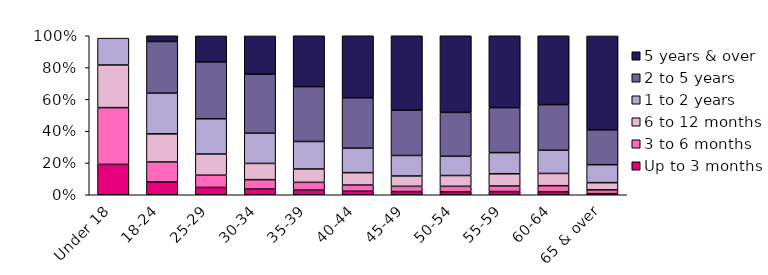
| Category | Up to 3 months | 3 to 6 months | 6 to 12 months | 1 to 2 years | 2 to 5 years | 5 years & over |
|---|---|---|---|---|---|---|
| Under 18 | 0.191 | 0.357 | 0.268 | 0.169 | 0 | 0 |
| 18-24 | 0.081 | 0.125 | 0.177 | 0.256 | 0.325 | 0.037 |
| 25-29 | 0.046 | 0.077 | 0.133 | 0.222 | 0.357 | 0.164 |
| 30-34 | 0.036 | 0.059 | 0.102 | 0.19 | 0.371 | 0.241 |
| 35-39 | 0.029 | 0.049 | 0.084 | 0.173 | 0.345 | 0.32 |
| 40-44 | 0.022 | 0.039 | 0.078 | 0.154 | 0.317 | 0.391 |
| 45-49 | 0.02 | 0.033 | 0.065 | 0.129 | 0.285 | 0.468 |
| 50-54 | 0.019 | 0.034 | 0.068 | 0.121 | 0.276 | 0.483 |
| 55-59 | 0.02 | 0.035 | 0.077 | 0.133 | 0.283 | 0.453 |
| 60-64 | 0.019 | 0.038 | 0.077 | 0.146 | 0.287 | 0.433 |
| 65 & over | 0.007 | 0.024 | 0.045 | 0.113 | 0.219 | 0.591 |